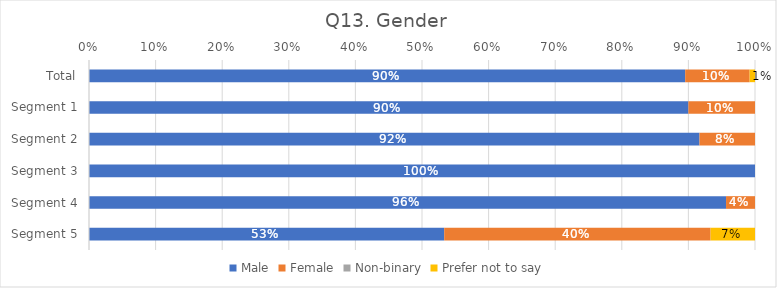
| Category | Male | Female | Non-binary | Prefer not to say |
|---|---|---|---|---|
| Total | 0.895 | 0.097 | 0 | 0.008 |
| Segment 1 | 0.9 | 0.1 | 0 | 0 |
| Segment 2 | 0.917 | 0.083 | 0 | 0 |
| Segment 3 | 1 | 0 | 0 | 0 |
| Segment 4 | 0.957 | 0.043 | 0 | 0 |
| Segment 5 | 0.533 | 0.4 | 0 | 0.067 |